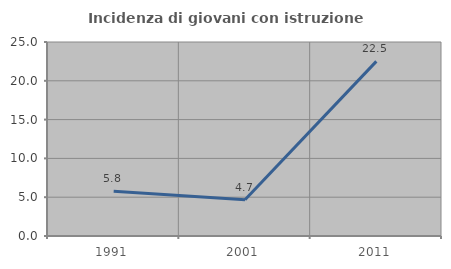
| Category | Incidenza di giovani con istruzione universitaria |
|---|---|
| 1991.0 | 5.776 |
| 2001.0 | 4.659 |
| 2011.0 | 22.5 |